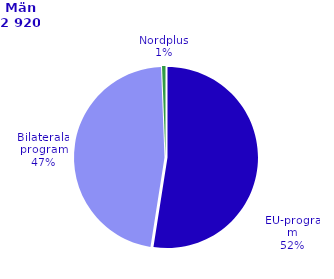
| Category | Series 0 |
|---|---|
| EU-program | 1535 |
| Bilaterala program | 1372 |
| Nordplus | 18 |